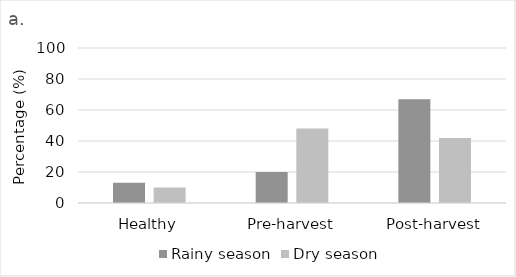
| Category | Rainy season | Dry season |
|---|---|---|
| Healthy | 13 | 10 |
| Pre-harvest | 20 | 48 |
| Post-harvest | 67 | 42 |